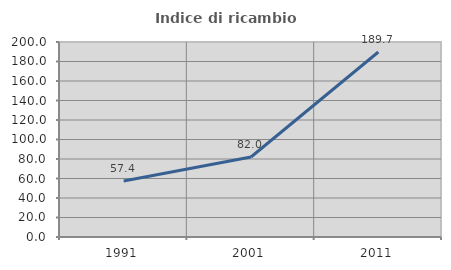
| Category | Indice di ricambio occupazionale  |
|---|---|
| 1991.0 | 57.419 |
| 2001.0 | 82.034 |
| 2011.0 | 189.718 |